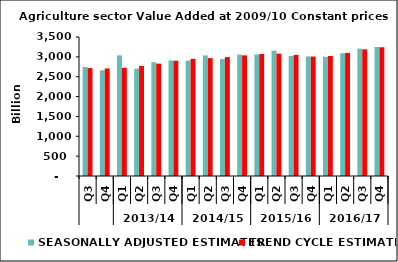
| Category | SEASONALLY ADJUSTED ESTIMATES | TREND CYCLE ESTIMATES |
|---|---|---|
| 0 | 2743.915 | 2717.591 |
| 1 | 2662.607 | 2709.058 |
| 2 | 3036.663 | 2724.704 |
| 3 | 2704.681 | 2768.906 |
| 4 | 2865.537 | 2828.529 |
| 5 | 2909.63 | 2901.482 |
| 6 | 2905.822 | 2950.656 |
| 7 | 3038.045 | 2968.931 |
| 8 | 2944.576 | 2994.972 |
| 9 | 3058.404 | 3037.555 |
| 10 | 3058.533 | 3073.17 |
| 11 | 3157.087 | 3080.924 |
| 12 | 3021.999 | 3049.826 |
| 13 | 3010.465 | 3008.608 |
| 14 | 3000.569 | 3022.754 |
| 15 | 3092.329 | 3098.98 |
| 16 | 3208.119 | 3188.302 |
| 17 | 3246.682 | 3241.871 |